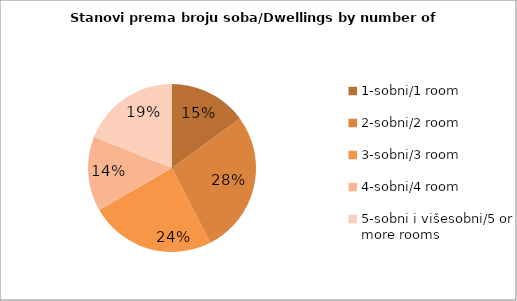
| Category | Series 0 |
|---|---|
| 1-sobni/1 room  | 95 |
| 2-sobni/2 room | 174 |
| 3-sobni/3 room | 153 |
| 4-sobni/4 room  | 91 |
| 5-sobni i višesobni/5 or more rooms  | 120 |